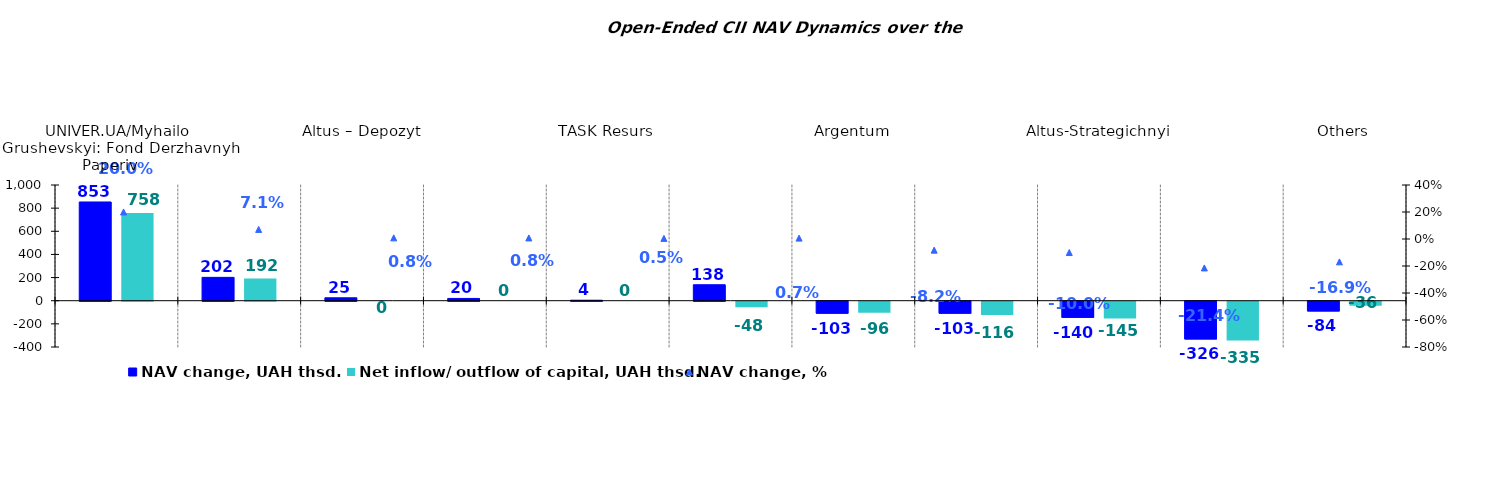
| Category | NAV change, UAH thsd. | Net inflow/ outflow of capital, UAH thsd. |
|---|---|---|
| UNIVER.UA/Myhailo Grushevskyi: Fond Derzhavnyh Paperiv    | 853.322 | 758.061 |
| UNIVER.UA/Taras Shevchenko: Fond Zaoshchadzhen | 201.734 | 192.144 |
| Altus – Depozyt | 25.323 | 0 |
| Altus – Zbalansovanyi | 19.643 | 0 |
| TASK Resurs | 4.204 | 0 |
| KINTO-Klasychnyi | 137.974 | -48.149 |
| Argentum | -103.187 | -95.533 |
| OTP Klasychnyi  | -103.457 | -115.711 |
| Altus-Strategichnyi | -139.578 | -145.14 |
| VSI | -326.169 | -335.028 |
| Others | -84.377 | -35.587 |